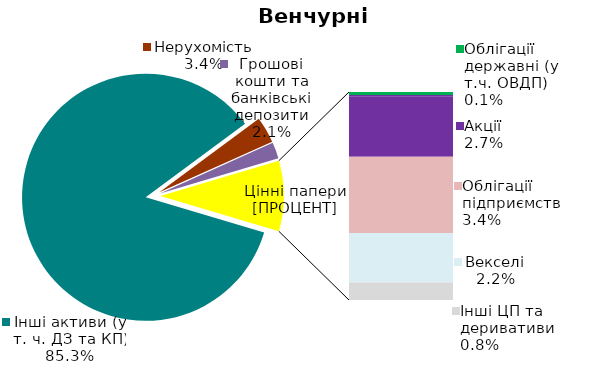
| Category | Series 0 |
|---|---|
| Інші активи (у т. ч. ДЗ та КП) | 0.853 |
| Нерухомість | 0.034 |
| Грошові кошти та банківські депозити | 0.021 |
| Банківські метали | 0 |
| Облігації державні (у т.ч. ОВДП) | 0.001 |
| Облігації місцевих позик | 0.001 |
| Акції | 0.027 |
| Облігації підприємств | 0.034 |
| Векселі | 0.022 |
| Інші ЦП та деривативи | 0.008 |